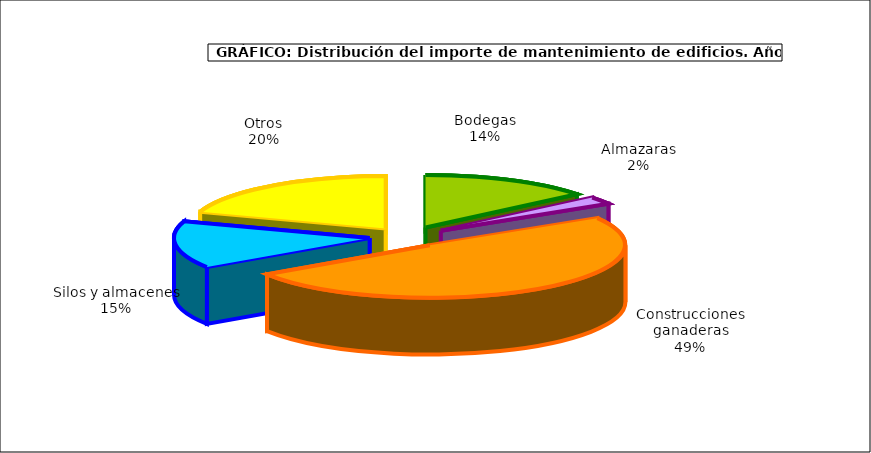
| Category | Series 0 |
|---|---|
| 0 | 89.912 |
| 1 | 14.619 |
| 2 | 314.826 |
| 3 | 92.65 |
| 4 | 126.854 |